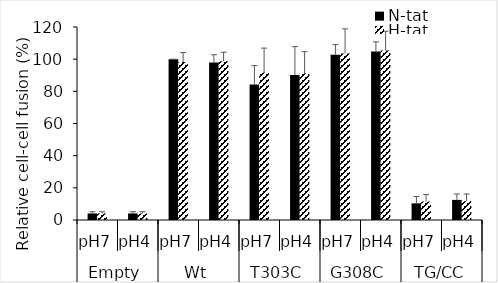
| Category | N-tat | H-tat |
|---|---|---|
| 0 | 4.082 | 4.082 |
| 1 | 4.082 | 4.082 |
| 2 | 100 | 98.197 |
| 3 | 97.876 | 98.775 |
| 4 | 84.284 | 91.729 |
| 5 | 90.196 | 91.169 |
| 6 | 102.811 | 103.474 |
| 7 | 104.69 | 105.422 |
| 8 | 10.354 | 11.508 |
| 9 | 12.501 | 11.699 |